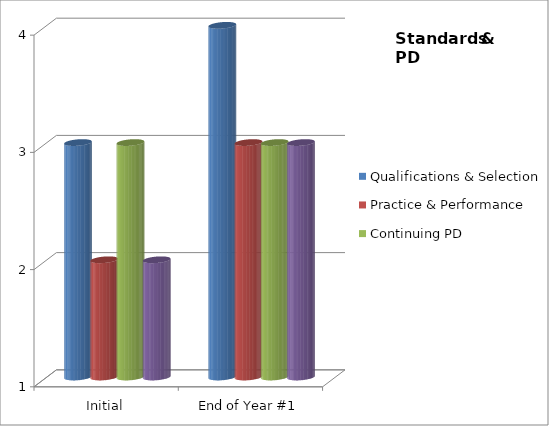
| Category | Qualifications & Selection  | Practice & Performance  | Continuing PD | Cultural Considerations  |
|---|---|---|---|---|
| Initial | 3 | 2 | 3 | 2 |
| End of Year #1 | 4 | 3 | 3 | 3 |